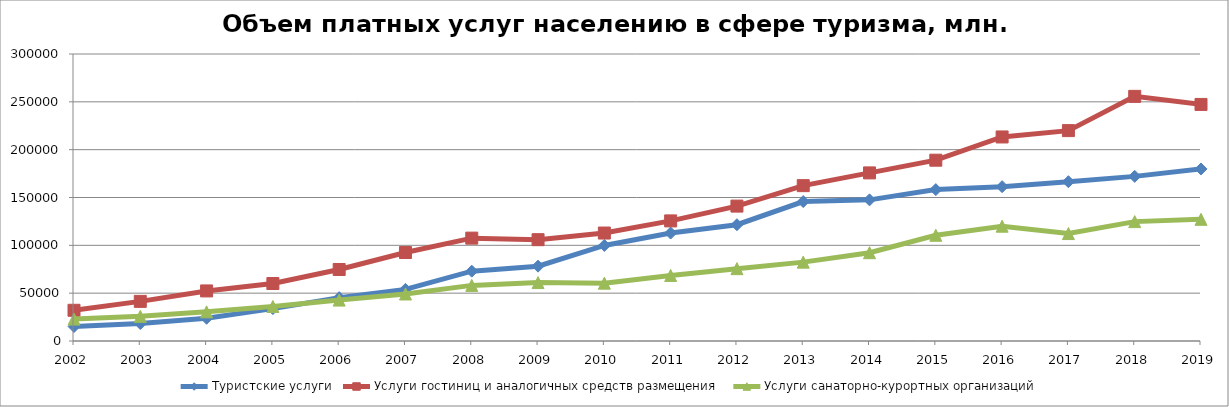
| Category | Туристские услуги | Услуги гостиниц и аналогичных средств размещения | Услуги санаторно-курортных организаций |
|---|---|---|---|
| 2002.0 | 15156.784 | 32103.639 | 22902.027 |
| 2003.0 | 18251.163 | 41429.807 | 25770.583 |
| 2004.0 | 23766.615 | 52341.684 | 30469.24 |
| 2005.0 | 33848.803 | 60098.124 | 36082.437 |
| 2006.0 | 45312.019 | 74743.723 | 42765.604 |
| 2007.0 | 53960.576 | 92479.57 | 49158.453 |
| 2008.0 | 72975.461 | 107521.663 | 58124.687 |
| 2009.0 | 78227.59 | 105903.557 | 61090.111 |
| 2010.0 | 99879 | 112855 | 60460 |
| 2011.0 | 112829 | 125541 | 68521 |
| 2012.0 | 121545 | 141012 | 75622 |
| 2013.0 | 145784 | 162387 | 82444 |
| 2014.0 | 147541 | 175709 | 92300 |
| 2015.0 | 158252 | 188992 | 110513 |
| 2016.0 | 161344 | 213288 | 120009 |
| 2017.0 | 166520 | 219916 | 112305 |
| 2018.0 | 172090 | 255708 | 124783 |
| 2019.0 | 179826 | 247279 | 127186 |